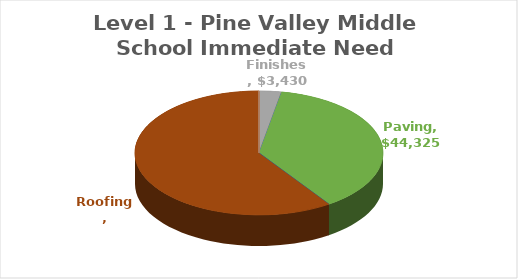
| Category | Series 0 |
|---|---|
| Electrical | 0 |
| Fencing | 0 |
| Finishes | 3430.1 |
| HVAC | 0 |
| LowVoltage | 0 |
| Paving | 44325 |
| Plumbing | 0 |
| Roofing | 70225 |
| Playground | 0 |